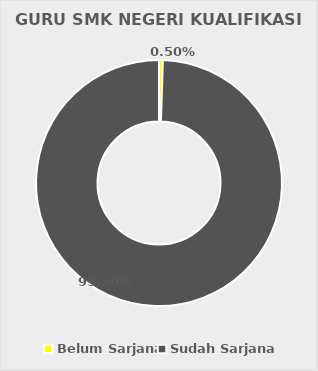
| Category | GURU SMK NEGERI KUALIFIKASI S1 |
|---|---|
| Belum Sarjana | 1 |
| Sudah Sarjana | 198 |